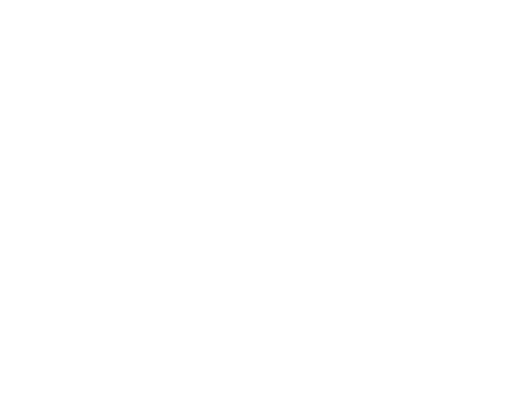
| Category | Series 0 | Series 1 | Series 2 |
|---|---|---|---|
| Impuestos | 2567377.62 | 0.05 |  |
| Cuotas y Aportaciones de Seguridad Social | 0 | 0 |  |
| Contribuciones de Mejoras | 0 | 0 |  |
| Derechos | 842452.36 | 0.016 |  |
| Productos | 67734.94 | 0.001 |  |
| Aprovechamientos | 306502.56 | 0.006 |  |
| Ingresos por Ventas de Bienes y Servicios | 0 | 0 |  |
| Participaciones y Aportaciones | 44010251.6 | 0.86 |  |
| Transferencias, Asignaciones, Subsidios y Otras Ayudas | 3385793.63 | 0.066 |  |
| Ingresos Derivados de Financiamientos | 0 | 0 |  |